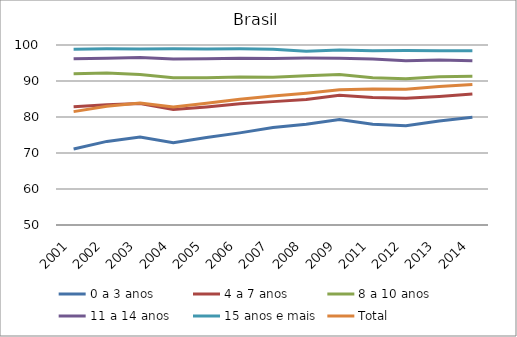
| Category | 0 a 3 anos | 4 a 7 anos | 8 a 10 anos | 11 a 14 anos | 15 anos e mais | Total |
|---|---|---|---|---|---|---|
| 2001.0 | 71.12 | 82.85 | 92.01 | 96.17 | 98.82 | 81.49 |
| 2002.0 | 73.22 | 83.41 | 92.23 | 96.33 | 98.94 | 82.96 |
| 2003.0 | 74.45 | 83.77 | 91.8 | 96.51 | 98.91 | 83.89 |
| 2004.0 | 72.85 | 82.1 | 90.93 | 96.08 | 98.96 | 82.81 |
| 2005.0 | 74.28 | 82.8 | 90.89 | 96.19 | 98.92 | 83.83 |
| 2006.0 | 75.59 | 83.65 | 91.1 | 96.33 | 98.95 | 84.94 |
| 2007.0 | 77.08 | 84.27 | 91.07 | 96.25 | 98.81 | 85.83 |
| 2008.0 | 78.01 | 84.86 | 91.48 | 96.37 | 98.23 | 86.63 |
| 2009.0 | 79.31 | 86.05 | 91.83 | 96.31 | 98.58 | 87.59 |
| 2011.0 | 78 | 85.4 | 90.9 | 96.1 | 98.4 | 87.8 |
| 2012.0 | 77.6 | 85.2 | 90.6 | 95.6 | 98.5 | 87.7 |
| 2013.0 | 78.9 | 85.7 | 91.2 | 95.8 | 98.4 | 88.5 |
| 2014.0 | 79.9 | 86.4 | 91.3 | 95.6 | 98.4 | 89 |